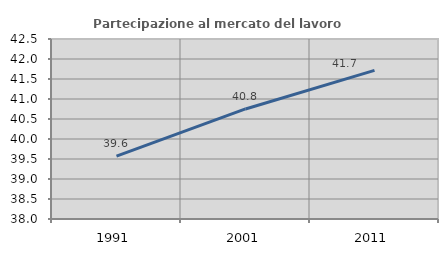
| Category | Partecipazione al mercato del lavoro  femminile |
|---|---|
| 1991.0 | 39.571 |
| 2001.0 | 40.751 |
| 2011.0 | 41.714 |